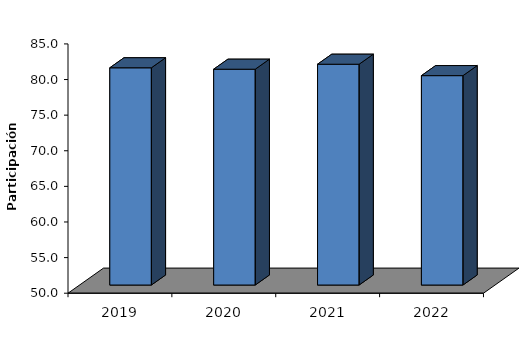
| Category | % Utilización |
|---|---|
| 2019-12-01 | 80.5 |
| 2020-12-01 | 80.3 |
| 2021-12-01 | 81 |
| 2022-12-01 | 79.4 |